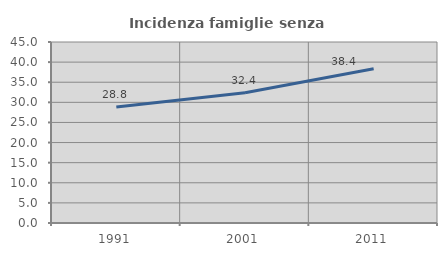
| Category | Incidenza famiglie senza nuclei |
|---|---|
| 1991.0 | 28.833 |
| 2001.0 | 32.396 |
| 2011.0 | 38.365 |